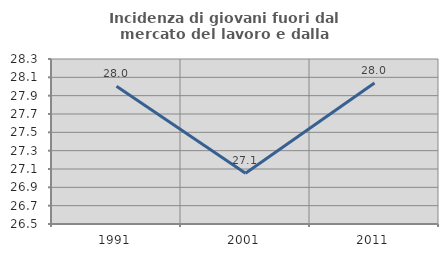
| Category | Incidenza di giovani fuori dal mercato del lavoro e dalla formazione  |
|---|---|
| 1991.0 | 28.003 |
| 2001.0 | 27.054 |
| 2011.0 | 28.038 |